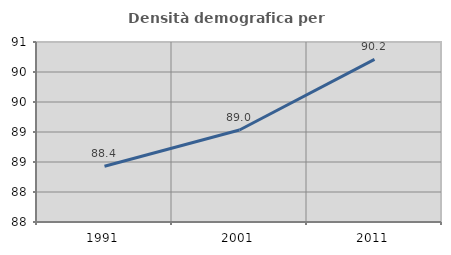
| Category | Densità demografica |
|---|---|
| 1991.0 | 88.429 |
| 2001.0 | 89.034 |
| 2011.0 | 90.211 |